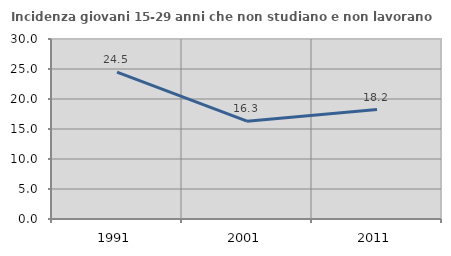
| Category | Incidenza giovani 15-29 anni che non studiano e non lavorano  |
|---|---|
| 1991.0 | 24.481 |
| 2001.0 | 16.309 |
| 2011.0 | 18.239 |